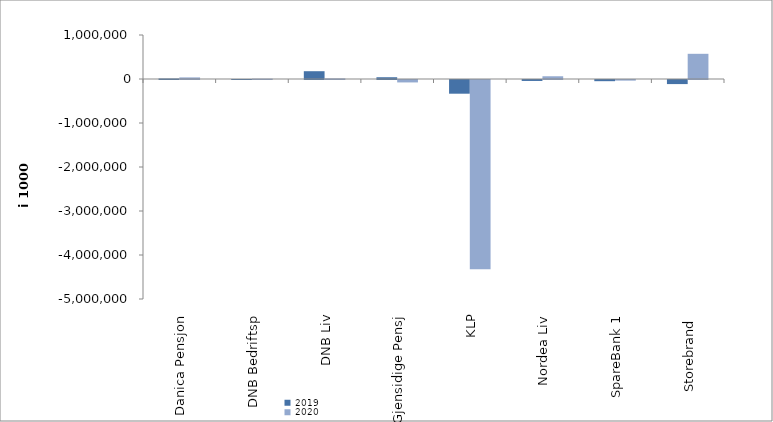
| Category | 2019 | 2020 |
|---|---|---|
| Danica Pensjon | 12101.765 | 36499.559 |
| DNB Bedriftsp | 517 | 7508 |
| DNB Liv | 177031 | 13951.686 |
| Gjensidige Pensj | 40284 | -55290 |
| KLP | -311467.572 | -4298472.749 |
| Nordea Liv | -21770 | 62384 |
| SpareBank 1 | -26898.823 | -14340.871 |
| Storebrand  | -92858.755 | 572543.809 |